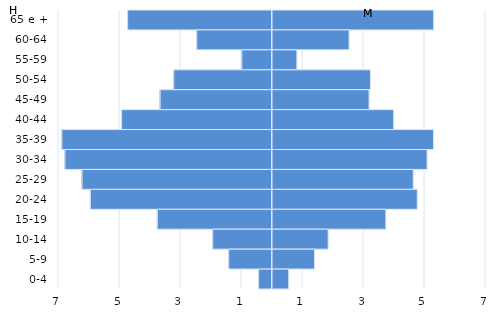
| Category | Homens | Mulheres |
|---|---|---|
| 65 e + | -4.734 | 5.319 |
| 60-64 | -2.468 | 2.543 |
| 55-59 | -0.989 | 0.833 |
| 50-54 | -3.22 | 3.245 |
| 45-49 | -3.669 | 3.199 |
| 40-44 | -4.93 | 4.007 |
| 35-39 | -6.888 | 5.314 |
| 30-34 | -6.787 | 5.102 |
| 25-29 | -6.227 | 4.648 |
| 20-24 | -5.955 | 4.779 |
| 15-19 | -3.76 | 3.749 |
| 10-14 | -1.943 | 1.857 |
| 5-9 | -1.418 | 1.413 |
| 0-4 | -0.439 | 0.565 |